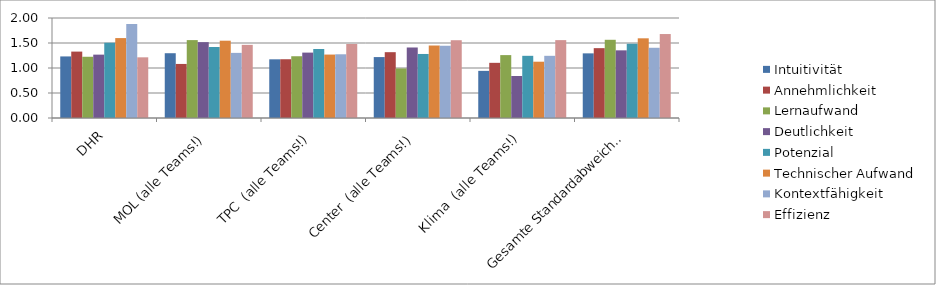
| Category | Intuitivität | Annehmlichkeit | Lernaufwand | Deutlichkeit | Potenzial | Technischer Aufwand | Kontextfähigkeit | Effizienz |
|---|---|---|---|---|---|---|---|---|
| DHR | 1.231 | 1.328 | 1.225 | 1.267 | 1.505 | 1.598 | 1.881 | 1.214 |
| MOL (alle Teams!) | 1.296 | 1.081 | 1.558 | 1.517 | 1.42 | 1.546 | 1.302 | 1.463 |
| TPC  (alle Teams!) | 1.174 | 1.175 | 1.235 | 1.308 | 1.38 | 1.269 | 1.274 | 1.48 |
| Center  (alle Teams!) | 1.219 | 1.316 | 0.991 | 1.41 | 1.281 | 1.45 | 1.445 | 1.556 |
| Klima  (alle Teams!) | 0.943 | 1.103 | 1.258 | 0.841 | 1.244 | 1.126 | 1.244 | 1.558 |
| Gesamte Standardabweichung | 1.293 | 1.397 | 1.564 | 1.353 | 1.485 | 1.594 | 1.405 | 1.679 |